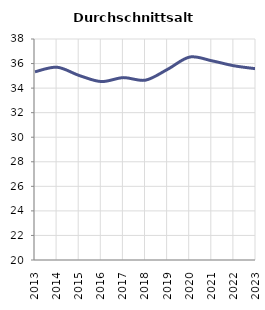
| Category | Durchschnittsalter |
|---|---|
| 2013.0 | 35.328 |
| 2014.0 | 35.699 |
| 2015.0 | 35.027 |
| 2016.0 | 34.534 |
| 2017.0 | 34.854 |
| 2018.0 | 34.648 |
| 2019.0 | 35.53 |
| 2020.0 | 36.53 |
| 2021.0 | 36.225 |
| 2022.0 | 35.82 |
| 2023.0 | 35.576 |